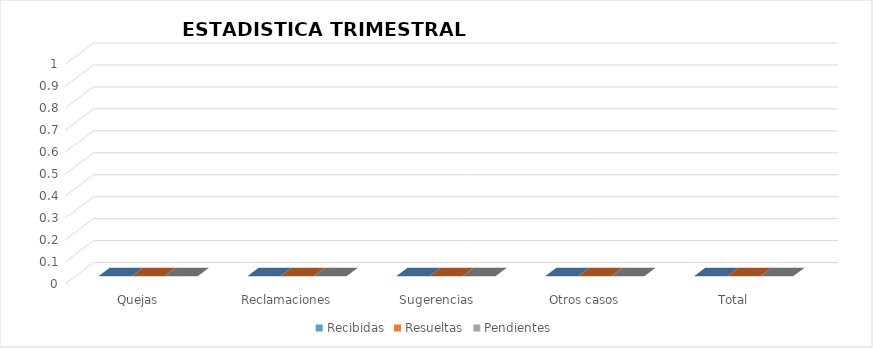
| Category | Recibidas | Resueltas | Pendientes |
|---|---|---|---|
| Quejas | 0 | 0 | 0 |
| Reclamaciones | 0 | 0 | 0 |
| Sugerencias | 0 | 0 | 0 |
| Otros casos | 0 | 0 | 0 |
| Total | 0 | 0 | 0 |